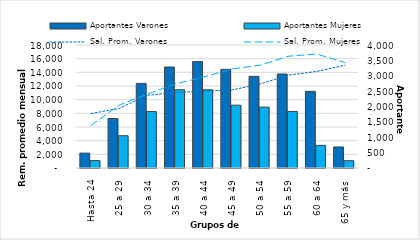
| Category | Aportantes Varones | Aportantes Mujeres |
|---|---|---|
| 0 | 484 | 241 |
| 1 | 1611 | 1050 |
| 2 | 2751 | 1836 |
| 3 | 3284 | 2545 |
| 4 | 3460 | 2544 |
| 5 | 3208 | 2043 |
| 6 | 2980 | 1980 |
| 7 | 3056 | 1839 |
| 8 | 2493 | 736 |
| 9 | 684 | 237 |